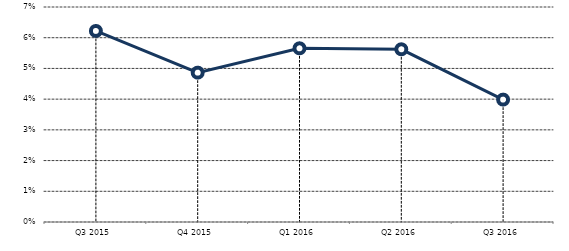
| Category | Series 0 |
|---|---|
| Q3 2015 | 0.062 |
| Q4 2015 | 0.049 |
| Q1 2016 | 0.057 |
| Q2 2016 | 0.056 |
| Q3 2016 | 0.04 |